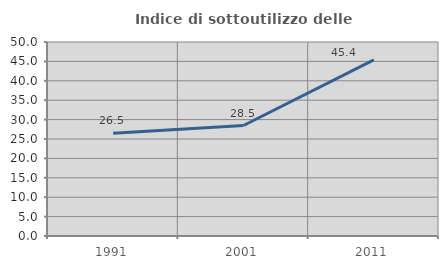
| Category | Indice di sottoutilizzo delle abitazioni  |
|---|---|
| 1991.0 | 26.471 |
| 2001.0 | 28.477 |
| 2011.0 | 45.399 |